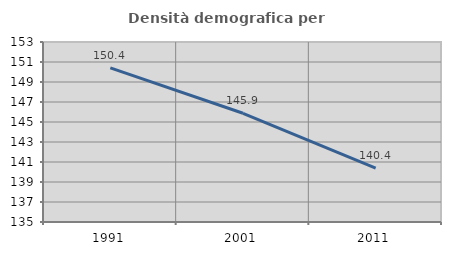
| Category | Densità demografica |
|---|---|
| 1991.0 | 150.416 |
| 2001.0 | 145.872 |
| 2011.0 | 140.382 |